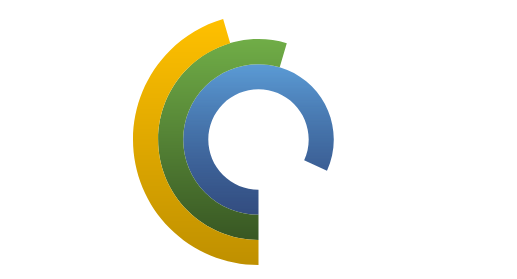
| Category | Service Level | Quality Score | Sales Conversion |
|---|---|---|---|
| Performance | 0.9 | 0.6 | 0.5 |
| Blank Area | 0.2 | 0.5 | 0.6 |